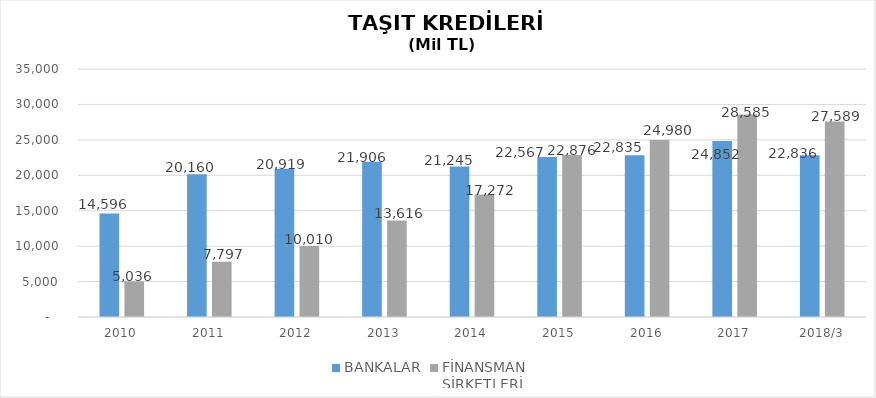
| Category | BANKALAR | FİNANSMAN 
ŞİRKETLERİ |
|---|---|---|
| 2010 | 14596 | 5035.89 |
| 2011 | 20160 | 7796.854 |
| 2012 | 20919 | 10009.755 |
| 2013 | 21906 | 13616.036 |
| 2014 | 21245 | 17271.844 |
| 2015 | 22567 | 22875.563 |
| 2016 | 22835 | 24980.231 |
| 2017 | 24852 | 28584.938 |
| 2018/3 | 22836 | 27588.785 |